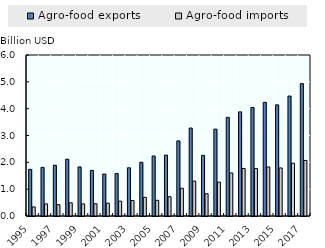
| Category | Agro-food exports | Agro-food imports |
|---|---|---|
| 1995.0 | 1.738 | 0.338 |
| 1996.0 | 1.811 | 0.452 |
| 1997.0 | 1.893 | 0.421 |
| 1998.0 | 2.117 | 0.491 |
| 1999.0 | 1.828 | 0.452 |
| 2000.0 | 1.7 | 0.456 |
| 2001.0 | 1.564 | 0.479 |
| 2002.0 | 1.581 | 0.553 |
| 2003.0 | 1.796 | 0.579 |
| 2004.0 | 2.003 | 0.695 |
| 2005.0 | 2.236 | 0.585 |
| 2006.0 | 2.269 | 0.717 |
| 2007.0 | 2.797 | 1.034 |
| 2008.0 | 3.277 | 1.3 |
| 2009.0 | 2.26 | 0.83 |
| 2010.0 | 3.238 | 1.26 |
| 2011.0 | 3.674 | 1.602 |
| 2012.0 | 3.88 | 1.772 |
| 2013.0 | 4.045 | 1.768 |
| 2014.0 | 4.237 | 1.827 |
| 2015.0 | 4.142 | 1.791 |
| 2016.0 | 4.47 | 1.968 |
| 2017.0 | 4.934 | 2.071 |